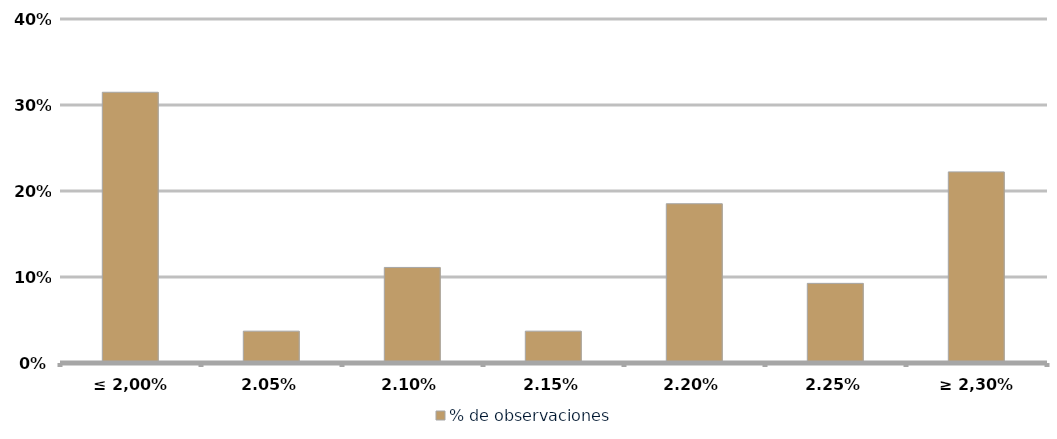
| Category | % de observaciones  |
|---|---|
| ≤ 2,00% | 0.315 |
| 2,05% | 0.037 |
| 2,10% | 0.111 |
| 2,15% | 0.037 |
| 2,20% | 0.185 |
| 2,25% | 0.093 |
| ≥ 2,30% | 0.222 |